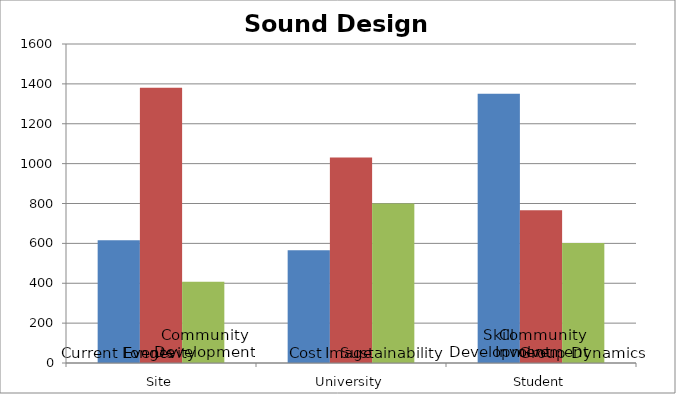
| Category | Alignment1 | Alignment2 | Alignment3 |
|---|---|---|---|
| 0 | 615.625 | 1380 | 407.5 |
| 1 | 565 | 1031.25 | 800 |
| 2 | 1350 | 765.625 | 602.5 |